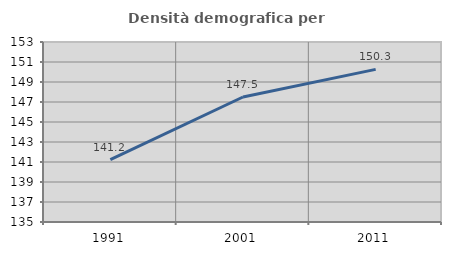
| Category | Densità demografica |
|---|---|
| 1991.0 | 141.23 |
| 2001.0 | 147.502 |
| 2011.0 | 150.261 |